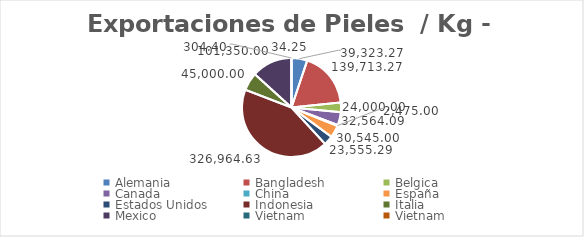
| Category | kg | Valor US  |
|---|---|---|
| Alemania | 39323.27 | 343957.87 |
| Bangladesh | 139713.27 | 363800.77 |
| Belgica | 24000 | 17600 |
| Canada | 32564.09 | 462199.06 |
| China | 2475 | 73173.7 |
| España | 30545 | 18327 |
| Estados Unidos | 23555.29 | 29145.12 |
| Indonesia | 326964.63 | 641374.23 |
| Italia | 45000 | 26000 |
| Mexico | 101350 | 32198.5 |
| Vietnam | 304.4 | 10989.01 |
| Vietnam | 34.25 | 973.56 |